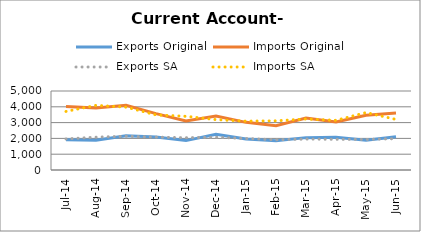
| Category | Exports Original | Imports Original | Exports SA | Imports SA |
|---|---|---|---|---|
| 2014-07-11 | 1919 | 4021 | 1966 | 3708 |
| 2014-08-11 | 1880 | 3932 | 2078 | 4091 |
| 2014-09-11 | 2161 | 4092 | 2138 | 3978 |
| 2014-10-11 | 2088 | 3570 | 2080 | 3487 |
| 2014-11-11 | 1861 | 3100 | 2043 | 3398 |
| 2014-12-11 | 2257 | 3409 | 2074 | 3189 |
| 2015-01-11 | 1964 | 3015 | 1992 | 3091 |
| 2015-02-11 | 1853 | 2799 | 1913 | 3113 |
| 2015-03-11 | 2049 | 3294 | 1958 | 3229 |
| 2015-04-11 | 2067 | 3045 | 1941 | 3143 |
| 2015-05-11 | 1880 | 3470 | 1936 | 3635 |
| 2015-06-11 | 2111 | 3610 | 1982 | 3202 |